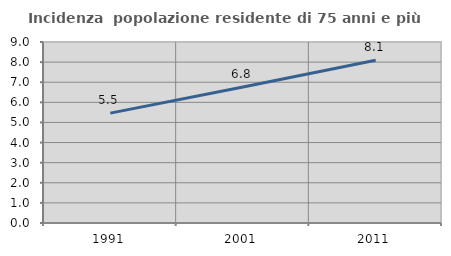
| Category | Incidenza  popolazione residente di 75 anni e più |
|---|---|
| 1991.0 | 5.464 |
| 2001.0 | 6.766 |
| 2011.0 | 8.094 |